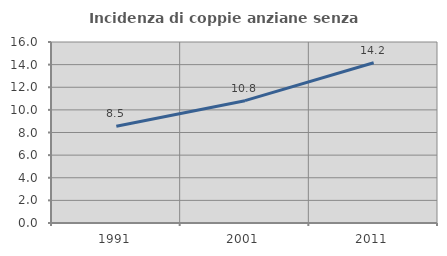
| Category | Incidenza di coppie anziane senza figli  |
|---|---|
| 1991.0 | 8.549 |
| 2001.0 | 10.814 |
| 2011.0 | 14.169 |